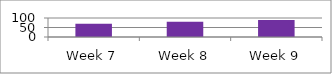
| Category | Series 0 |
|---|---|
| Week 7 | 70 |
| Week 8 | 80 |
| Week 9 | 90 |